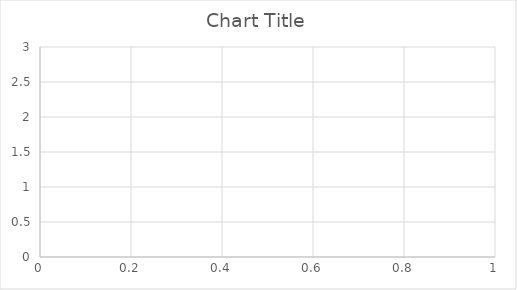
| Category | Series 0 |
|---|---|
| 0 | 0.437 |
| 1 | 0.437 |
| 2 | 0.437 |
| 3 | 0.437 |
| 4 | 0.373 |
| 5 | 0.383 |
| 6 | 0.391 |
| 7 | 0.356 |
| 8 | 0.33 |
| 9 | 0.34 |
| 10 | 0.349 |
| 11 | 0.356 |
| 12 | 0.363 |
| 13 | 0.368 |
| 14 | 0.373 |
| 15 | 0.356 |
| 16 | 0.361 |
| 17 | 0.347 |
| 18 | 0.352 |
| 19 | 0.34 |
| 20 | 0.345 |
| 21 | 0.349 |
| 22 | 0.353 |
| 23 | 0.356 |
| 24 | 0.36 |
| 25 | 0.363 |
| 26 | 0.365 |
| 27 | 0.368 |
| 28 | 0.359 |
| 29 | 0.351 |
| 30 | 0.398 |
| 31 | 0.441 |
| 32 | 0.441 |
| 33 | 0.441 |
| 34 | 0.48 |
| 35 | 0.478 |
| 36 | 0.477 |
| 37 | 0.512 |
| 38 | 0.51 |
| 39 | 0.508 |
| 40 | 0.539 |
| 41 | 0.529 |
| 42 | 0.52 |
| 43 | 0.549 |
| 44 | 0.539 |
| 45 | 0.566 |
| 46 | 0.564 |
| 47 | 0.561 |
| 48 | 0.552 |
| 49 | 0.543 |
| 50 | 0.568 |
| 51 | 0.591 |
| 52 | 0.588 |
| 53 | 0.585 |
| 54 | 0.583 |
| 55 | 0.574 |
| 56 | 0.566 |
| 57 | 0.587 |
| 58 | 0.579 |
| 59 | 0.577 |
| 60 | 0.569 |
| 61 | 0.562 |
| 62 | 0.56 |
| 63 | 0.553 |
| 64 | 0.551 |
| 65 | 0.545 |
| 66 | 0.543 |
| 67 | 0.542 |
| 68 | 0.54 |
| 69 | 0.539 |
| 70 | 0.556 |
| 71 | 0.555 |
| 72 | 0.553 |
| 73 | 0.551 |
| 74 | 0.55 |
| 75 | 0.548 |
| 76 | 0.547 |
| 77 | 0.563 |
| 78 | 0.561 |
| 79 | 0.56 |
| 80 | 0.575 |
| 81 | 0.573 |
| 82 | 0.568 |
| 83 | 0.562 |
| 84 | 0.557 |
| 85 | 0.572 |
| 86 | 0.57 |
| 87 | 0.565 |
| 88 | 0.563 |
| 89 | 0.558 |
| 90 | 0.557 |
| 91 | 0.552 |
| 92 | 0.548 |
| 93 | 0.546 |
| 94 | 0.56 |
| 95 | 0.572 |
| 96 | 0.568 |
| 97 | 0.563 |
| 98 | 0.562 |
| 99 | 0.557 |
| 100 | 0.57 |
| 101 | 0.582 |
| 102 | 0.593 |
| 103 | 0.592 |
| 104 | 0.59 |
| 105 | 0.589 |
| 106 | 0.584 |
| 107 | 0.596 |
| 108 | 0.591 |
| 109 | 0.59 |
| 110 | 0.588 |
| 111 | 0.584 |
| 112 | 0.583 |
| 113 | 0.593 |
| 114 | 0.604 |
| 115 | 0.602 |
| 116 | 0.598 |
| 117 | 0.597 |
| 118 | 0.596 |
| 119 | 0.594 |
| 120 | 0.604 |
| 121 | 0.6 |
| 122 | 0.599 |
| 123 | 0.595 |
| 124 | 0.591 |
| 125 | 0.59 |
| 126 | 0.586 |
| 127 | 0.585 |
| 128 | 0.584 |
| 129 | 0.58 |
| 130 | 0.589 |
| 131 | 0.588 |
| 132 | 0.585 |
| 133 | 0.581 |
| 134 | 0.58 |
| 135 | 0.577 |
| 136 | 0.576 |
| 137 | 0.572 |
| 138 | 0.571 |
| 139 | 0.58 |
| 140 | 0.577 |
| 141 | 0.576 |
| 142 | 0.575 |
| 143 | 0.574 |
| 144 | 0.573 |
| 145 | 0.57 |
| 146 | 0.567 |
| 147 | 0.566 |
| 148 | 0.565 |
| 149 | 0.573 |
| 150 | 0.581 |
| 151 | 0.58 |
| 152 | 0.579 |
| 153 | 0.576 |
| 154 | 0.573 |
| 155 | 0.57 |
| 156 | 0.57 |
| 157 | 0.569 |
| 158 | 0.566 |
| 159 | 0.574 |
| 160 | 0.573 |
| 161 | 0.57 |
| 162 | 0.569 |
| 163 | 0.568 |
| 164 | 0.566 |
| 165 | 0.565 |
| 166 | 0.564 |
| 167 | 0.561 |
| 168 | 0.561 |
| 169 | 0.56 |
| 170 | 0.567 |
| 171 | 0.564 |
| 172 | 0.562 |
| 173 | 0.561 |
| 174 | 0.56 |
| 175 | 0.567 |
| 176 | 0.567 |
| 177 | 0.574 |
| 178 | 0.573 |
| 179 | 0.572 |
| 180 | 0.57 |
| 181 | 0.567 |
| 182 | 0.566 |
| 183 | 0.566 |
| 184 | 0.565 |
| 185 | 0.564 |
| 186 | 0.564 |
| 187 | 0.563 |
| 188 | 0.561 |
| 189 | 0.567 |
| 190 | 0.573 |
| 191 | 0.573 |
| 192 | 0.579 |
| 193 | 0.578 |
| 194 | 0.578 |
| 195 | 0.577 |
| 196 | 0.575 |
| 197 | 0.574 |
| 198 | 0.572 |
| 199 | 0.578 |
| 200 | 0.577 |
| 201 | 0.576 |
| 202 | 0.576 |
| 203 | 0.575 |
| 204 | 0.581 |
| 205 | 0.58 |
| 206 | 0.579 |
| 207 | 0.585 |
| 208 | 0.585 |
| 209 | 0.582 |
| 210 | 0.58 |
| 211 | 0.579 |
| 212 | 0.579 |
| 213 | 0.584 |
| 214 | 0.584 |
| 215 | 0.583 |
| 216 | 0.581 |
| 217 | 0.58 |
| 218 | 0.58 |
| 219 | 0.585 |
| 220 | 0.591 |
| 221 | 0.588 |
| 222 | 0.588 |
| 223 | 0.587 |
| 224 | 0.586 |
| 225 | 0.586 |
| 226 | 0.584 |
| 227 | 0.582 |
| 228 | 0.581 |
| 229 | 0.586 |
| 230 | 0.584 |
| 231 | 0.582 |
| 232 | 0.582 |
| 233 | 0.58 |
| 234 | 0.585 |
| 235 | 0.59 |
| 236 | 0.589 |
| 237 | 0.587 |
| 238 | 0.585 |
| 239 | 0.59 |
| 240 | 0.59 |
| 241 | 0.589 |
| 242 | 0.587 |
| 243 | 0.592 |
| 244 | 0.591 |
| 245 | 0.591 |
| 246 | 0.59 |
| 247 | 0.588 |
| 248 | 0.586 |
| 249 | 0.586 |
| 250 | 0.585 |
| 251 | 0.585 |
| 252 | 0.589 |
| 253 | 0.587 |
| 254 | 0.592 |
| 255 | 0.597 |
| 256 | 0.596 |
| 257 | 0.601 |
| 258 | 0.599 |
| 259 | 0.604 |
| 260 | 0.602 |
| 261 | 0.601 |
| 262 | 0.6 |
| 263 | 0.599 |
| 264 | 0.603 |
| 265 | 0.602 |
| 266 | 0.602 |
| 267 | 0.601 |
| 268 | 0.601 |
| 269 | 0.599 |
| 270 | 0.598 |
| 271 | 0.598 |
| 272 | 0.596 |
| 273 | 0.594 |
| 274 | 0.592 |
| 275 | 0.592 |
| 276 | 0.59 |
| 277 | 0.59 |
| 278 | 0.589 |
| 279 | 0.587 |
| 280 | 0.587 |
| 281 | 0.591 |
| 282 | 0.589 |
| 283 | 0.588 |
| 284 | 0.592 |
| 285 | 0.596 |
| 286 | 0.596 |
| 287 | 0.594 |
| 288 | 0.593 |
| 289 | 0.592 |
| 290 | 0.591 |
| 291 | 0.59 |
| 292 | 0.589 |
| 293 | 0.593 |
| 294 | 0.593 |
| 295 | 0.592 |
| 296 | 0.592 |
| 297 | 0.596 |
| 298 | 0.594 |
| 299 | 0.593 |
| 300 | 0.592 |
| 301 | 0.591 |
| 302 | 0.595 |
| 303 | 0.599 |
| 304 | 0.599 |
| 305 | 0.598 |
| 306 | 0.602 |
| 307 | 0.6 |
| 308 | 0.599 |
| 309 | 0.597 |
| 310 | 0.597 |
| 311 | 0.595 |
| 312 | 0.594 |
| 313 | 0.592 |
| 314 | 0.592 |
| 315 | 0.596 |
| 316 | 0.595 |
| 317 | 0.594 |
| 318 | 0.597 |
| 319 | 0.597 |
| 320 | 0.601 |
| 321 | 0.6 |
| 322 | 0.599 |
| 323 | 0.597 |
| 324 | 0.597 |
| 325 | 0.595 |
| 326 | 0.594 |
| 327 | 0.593 |
| 328 | 0.593 |
| 329 | 0.592 |
| 330 | 0.592 |
| 331 | 0.595 |
| 332 | 0.594 |
| 333 | 0.592 |
| 334 | 0.591 |
| 335 | 0.591 |
| 336 | 0.594 |
| 337 | 0.594 |
| 338 | 0.593 |
| 339 | 0.592 |
| 340 | 0.591 |
| 341 | 0.591 |
| 342 | 0.589 |
| 343 | 0.593 |
| 344 | 0.596 |
| 345 | 0.595 |
| 346 | 0.594 |
| 347 | 0.593 |
| 348 | 0.593 |
| 349 | 0.592 |
| 350 | 0.591 |
| 351 | 0.59 |
| 352 | 0.588 |
| 353 | 0.587 |
| 354 | 0.587 |
| 355 | 0.585 |
| 356 | 0.585 |
| 357 | 0.588 |
| 358 | 0.592 |
| 359 | 0.591 |
| 360 | 0.591 |
| 361 | 0.589 |
| 362 | 0.589 |
| 363 | 0.589 |
| 364 | 0.588 |
| 365 | 0.588 |
| 366 | 0.586 |
| 367 | 0.59 |
| 368 | 0.588 |
| 369 | 0.587 |
| 370 | 0.59 |
| 371 | 0.59 |
| 372 | 0.593 |
| 373 | 0.593 |
| 374 | 0.592 |
| 375 | 0.592 |
| 376 | 0.591 |
| 377 | 0.594 |
| 378 | 0.597 |
| 379 | 0.597 |
| 380 | 0.596 |
| 381 | 0.595 |
| 382 | 0.594 |
| 383 | 0.593 |
| 384 | 0.592 |
| 385 | 0.595 |
| 386 | 0.595 |
| 387 | 0.598 |
| 388 | 0.601 |
| 389 | 0.6 |
| 390 | 0.603 |
| 391 | 0.606 |
| 392 | 0.605 |
| 393 | 0.605 |
| 394 | 0.604 |
| 395 | 0.602 |
| 396 | 0.602 |
| 397 | 0.601 |
| 398 | 0.6 |
| 399 | 0.6 |
| 400 | 0.6 |
| 401 | 0.599 |
| 402 | 0.598 |
| 403 | 0.601 |
| 404 | 0.6 |
| 405 | 0.599 |
| 406 | 0.602 |
| 407 | 0.602 |
| 408 | 0.605 |
| 409 | 0.604 |
| 410 | 0.603 |
| 411 | 0.602 |
| 412 | 0.605 |
| 413 | 0.604 |
| 414 | 0.603 |
| 415 | 0.603 |
| 416 | 0.602 |
| 417 | 0.605 |
| 418 | 0.604 |
| 419 | 0.603 |
| 420 | 0.606 |
| 421 | 0.605 |
| 422 | 0.605 |
| 423 | 0.604 |
| 424 | 0.603 |
| 425 | 0.603 |
| 426 | 0.603 |
| 427 | 0.601 |
| 428 | 0.604 |
| 429 | 0.607 |
| 430 | 0.607 |
| 431 | 0.609 |
| 432 | 0.608 |
| 433 | 0.608 |
| 434 | 0.607 |
| 435 | 0.607 |
| 436 | 0.607 |
| 437 | 0.606 |
| 438 | 0.609 |
| 439 | 0.609 |
| 440 | 0.607 |
| 441 | 0.606 |
| 442 | 0.609 |
| 443 | 0.609 |
| 444 | 0.608 |
| 445 | 0.607 |
| 446 | 0.607 |
| 447 | 0.606 |
| 448 | 0.606 |
| 449 | 0.609 |
| 450 | 0.608 |
| 451 | 0.608 |
| 452 | 0.608 |
| 453 | 0.607 |
| 454 | 0.607 |
| 455 | 0.609 |
| 456 | 0.608 |
| 457 | 0.608 |
| 458 | 0.607 |
| 459 | 0.606 |
| 460 | 0.609 |
| 461 | 0.608 |
| 462 | 0.611 |
| 463 | 0.609 |
| 464 | 0.609 |
| 465 | 0.609 |
| 466 | 0.608 |
| 467 | 0.607 |
| 468 | 0.607 |
| 469 | 0.607 |
| 470 | 0.606 |
| 471 | 0.609 |
| 472 | 0.608 |
| 473 | 0.611 |
| 474 | 0.611 |
| 475 | 0.61 |
| 476 | 0.61 |
| 477 | 0.612 |
| 478 | 0.612 |
| 479 | 0.611 |
| 480 | 0.61 |
| 481 | 0.609 |
| 482 | 0.608 |
| 483 | 0.607 |
| 484 | 0.607 |
| 485 | 0.607 |
| 486 | 0.606 |
| 487 | 0.605 |
| 488 | 0.608 |
| 489 | 0.607 |
| 490 | 0.607 |
| 491 | 0.61 |
| 492 | 0.609 |
| 493 | 0.609 |
| 494 | 0.608 |
| 495 | 0.608 |
| 496 | 0.608 |
| 497 | 0.607 |
| 498 | 0.607 |
| 499 | 0.607 |
| 500 | 0.609 |
| 501 | 0.609 |
| 502 | 0.608 |
| 503 | 0.608 |
| 504 | 0.607 |
| 505 | 0.606 |
| 506 | 0.606 |
| 507 | 0.605 |
| 508 | 0.604 |
| 509 | 0.604 |
| 510 | 0.603 |
| 511 | 0.605 |
| 512 | 0.605 |
| 513 | 0.604 |
| 514 | 0.603 |
| 515 | 0.602 |
| 516 | 0.601 |
| 517 | 0.604 |
| 518 | 0.603 |
| 519 | 0.605 |
| 520 | 0.604 |
| 521 | 0.606 |
| 522 | 0.609 |
| 523 | 0.608 |
| 524 | 0.607 |
| 525 | 0.606 |
| 526 | 0.606 |
| 527 | 0.605 |
| 528 | 0.604 |
| 529 | 0.604 |
| 530 | 0.603 |
| 531 | 0.602 |
| 532 | 0.604 |
| 533 | 0.603 |
| 534 | 0.603 |
| 535 | 0.602 |
| 536 | 0.601 |
| 537 | 0.603 |
| 538 | 0.605 |
| 539 | 0.604 |
| 540 | 0.604 |
| 541 | 0.604 |
| 542 | 0.603 |
| 543 | 0.603 |
| 544 | 0.603 |
| 545 | 0.605 |
| 546 | 0.605 |
| 547 | 0.604 |
| 548 | 0.604 |
| 549 | 0.603 |
| 550 | 0.603 |
| 551 | 0.602 |
| 552 | 0.601 |
| 553 | 0.601 |
| 554 | 0.6 |
| 555 | 0.6 |
| 556 | 0.6 |
| 557 | 0.6 |
| 558 | 0.599 |
| 559 | 0.598 |
| 560 | 0.597 |
| 561 | 0.599 |
| 562 | 0.598 |
| 563 | 0.598 |
| 564 | 0.597 |
| 565 | 0.596 |
| 566 | 0.598 |
| 567 | 0.597 |
| 568 | 0.6 |
| 569 | 0.599 |
| 570 | 0.601 |
| 571 | 0.601 |
| 572 | 0.6 |
| 573 | 0.599 |
| 574 | 0.601 |
| 575 | 0.601 |
| 576 | 0.6 |
| 577 | 0.6 |
| 578 | 0.599 |
| 579 | 0.598 |
| 580 | 0.6 |
| 581 | 0.6 |
| 582 | 0.599 |
| 583 | 0.598 |
| 584 | 0.598 |
| 585 | 0.597 |
| 586 | 0.599 |
| 587 | 0.601 |
| 588 | 0.6 |
| 589 | 0.599 |
| 590 | 0.598 |
| 591 | 0.598 |
| 592 | 0.598 |
| 593 | 0.6 |
| 594 | 0.6 |
| 595 | 0.599 |
| 596 | 0.599 |
| 597 | 0.599 |
| 598 | 0.601 |
| 599 | 0.6 |
| 600 | 0.6 |
| 601 | 0.599 |
| 602 | 0.599 |
| 603 | 0.598 |
| 604 | 0.598 |
| 605 | 0.597 |
| 606 | 0.597 |
| 607 | 0.599 |
| 608 | 0.599 |
| 609 | 0.598 |
| 610 | 0.597 |
| 611 | 0.596 |
| 612 | 0.598 |
| 613 | 0.598 |
| 614 | 0.597 |
| 615 | 0.599 |
| 616 | 0.601 |
| 617 | 0.6 |
| 618 | 0.6 |
| 619 | 0.599 |
| 620 | 0.599 |
| 621 | 0.598 |
| 622 | 0.598 |
| 623 | 0.597 |
| 624 | 0.597 |
| 625 | 0.596 |
| 626 | 0.595 |
| 627 | 0.595 |
| 628 | 0.595 |
| 629 | 0.594 |
| 630 | 0.593 |
| 631 | 0.593 |
| 632 | 0.592 |
| 633 | 0.594 |
| 634 | 0.594 |
| 635 | 0.593 |
| 636 | 0.593 |
| 637 | 0.593 |
| 638 | 0.592 |
| 639 | 0.592 |
| 640 | 0.592 |
| 641 | 0.591 |
| 642 | 0.591 |
| 643 | 0.59 |
| 644 | 0.592 |
| 645 | 0.592 |
| 646 | 0.591 |
| 647 | 0.591 |
| 648 | 0.59 |
| 649 | 0.592 |
| 650 | 0.591 |
| 651 | 0.591 |
| 652 | 0.591 |
| 653 | 0.591 |
| 654 | 0.59 |
| 655 | 0.59 |
| 656 | 0.59 |
| 657 | 0.59 |
| 658 | 0.59 |
| 659 | 0.591 |
| 660 | 0.591 |
| 661 | 0.591 |
| 662 | 0.59 |
| 663 | 0.59 |
| 664 | 0.59 |
| 665 | 0.59 |
| 666 | 0.589 |
| 667 | 0.589 |
| 668 | 0.589 |
| 669 | 0.589 |
| 670 | 0.588 |
| 671 | 0.588 |
| 672 | 0.588 |
| 673 | 0.587 |
| 674 | 0.587 |
| 675 | 0.586 |
| 676 | 0.586 |
| 677 | 0.585 |
| 678 | 0.585 |
| 679 | 0.585 |
| 680 | 0.585 |
| 681 | 0.587 |
| 682 | 0.586 |
| 683 | 0.588 |
| 684 | 0.588 |
| 685 | 0.588 |
| 686 | 0.587 |
| 687 | 0.587 |
| 688 | 0.586 |
| 689 | 0.586 |
| 690 | 0.586 |
| 691 | 0.586 |
| 692 | 0.586 |
| 693 | 0.585 |
| 694 | 0.585 |
| 695 | 0.585 |
| 696 | 0.584 |
| 697 | 0.584 |
| 698 | 0.583 |
| 699 | 0.583 |
| 700 | 0.583 |
| 701 | 0.582 |
| 702 | 0.582 |
| 703 | 0.582 |
| 704 | 0.581 |
| 705 | 0.583 |
| 706 | 0.583 |
| 707 | 0.583 |
| 708 | 0.582 |
| 709 | 0.581 |
| 710 | 0.581 |
| 711 | 0.58 |
| 712 | 0.579 |
| 713 | 0.579 |
| 714 | 0.578 |
| 715 | 0.58 |
| 716 | 0.58 |
| 717 | 0.58 |
| 718 | 0.579 |
| 719 | 0.578 |
| 720 | 0.578 |
| 721 | 0.578 |
| 722 | 0.577 |
| 723 | 0.577 |
| 724 | 0.577 |
| 725 | 0.577 |
| 726 | 0.579 |
| 727 | 0.58 |
| 728 | 0.58 |
| 729 | 0.58 |
| 730 | 0.579 |
| 731 | 0.579 |
| 732 | 0.579 |
| 733 | 0.578 |
| 734 | 0.578 |
| 735 | 0.577 |
| 736 | 0.577 |
| 737 | 0.576 |
| 738 | 0.576 |
| 739 | 0.576 |
| 740 | 0.575 |
| 741 | 0.577 |
| 742 | 0.578 |
| 743 | 0.578 |
| 744 | 0.578 |
| 745 | 0.578 |
| 746 | 0.578 |
| 747 | 0.577 |
| 748 | 0.577 |
| 749 | 0.577 |
| 750 | 0.579 |
| 751 | 0.578 |
| 752 | 0.578 |
| 753 | 0.577 |
| 754 | 0.579 |
| 755 | 0.579 |
| 756 | 0.578 |
| 757 | 0.578 |
| 758 | 0.578 |
| 759 | 0.577 |
| 760 | 0.577 |
| 761 | 0.577 |
| 762 | 0.579 |
| 763 | 0.579 |
| 764 | 0.58 |
| 765 | 0.58 |
| 766 | 0.58 |
| 767 | 0.58 |
| 768 | 0.581 |
| 769 | 0.581 |
| 770 | 0.58 |
| 771 | 0.58 |
| 772 | 0.58 |
| 773 | 0.579 |
| 774 | 0.579 |
| 775 | 0.579 |
| 776 | 0.578 |
| 777 | 0.58 |
| 778 | 0.582 |
| 779 | 0.581 |
| 780 | 0.581 |
| 781 | 0.581 |
| 782 | 0.58 |
| 783 | 0.58 |
| 784 | 0.58 |
| 785 | 0.579 |
| 786 | 0.581 |
| 787 | 0.58 |
| 788 | 0.58 |
| 789 | 0.581 |
| 790 | 0.581 |
| 791 | 0.583 |
| 792 | 0.582 |
| 793 | 0.582 |
| 794 | 0.581 |
| 795 | 0.581 |
| 796 | 0.581 |
| 797 | 0.581 |
| 798 | 0.582 |
| 799 | 0.582 |
| 800 | 0.581 |
| 801 | 0.581 |
| 802 | 0.583 |
| 803 | 0.583 |
| 804 | 0.582 |
| 805 | 0.582 |
| 806 | 0.582 |
| 807 | 0.582 |
| 808 | 0.581 |
| 809 | 0.581 |
| 810 | 0.583 |
| 811 | 0.582 |
| 812 | 0.582 |
| 813 | 0.582 |
| 814 | 0.582 |
| 815 | 0.581 |
| 816 | 0.58 |
| 817 | 0.58 |
| 818 | 0.58 |
| 819 | 0.579 |
| 820 | 0.579 |
| 821 | 0.579 |
| 822 | 0.579 |
| 823 | 0.578 |
| 824 | 0.58 |
| 825 | 0.579 |
| 826 | 0.579 |
| 827 | 0.579 |
| 828 | 0.578 |
| 829 | 0.578 |
| 830 | 0.577 |
| 831 | 0.577 |
| 832 | 0.577 |
| 833 | 0.577 |
| 834 | 0.576 |
| 835 | 0.576 |
| 836 | 0.576 |
| 837 | 0.575 |
| 838 | 0.575 |
| 839 | 0.577 |
| 840 | 0.578 |
| 841 | 0.578 |
| 842 | 0.579 |
| 843 | 0.578 |
| 844 | 0.578 |
| 845 | 0.58 |
| 846 | 0.579 |
| 847 | 0.579 |
| 848 | 0.579 |
| 849 | 0.58 |
| 850 | 0.58 |
| 851 | 0.581 |
| 852 | 0.581 |
| 853 | 0.581 |
| 854 | 0.581 |
| 855 | 0.58 |
| 856 | 0.58 |
| 857 | 0.58 |
| 858 | 0.58 |
| 859 | 0.579 |
| 860 | 0.579 |
| 861 | 0.58 |
| 862 | 0.582 |
| 863 | 0.582 |
| 864 | 0.581 |
| 865 | 0.58 |
| 866 | 0.58 |
| 867 | 0.579 |
| 868 | 0.579 |
| 869 | 0.579 |
| 870 | 0.578 |
| 871 | 0.578 |
| 872 | 0.578 |
| 873 | 0.577 |
| 874 | 0.577 |
| 875 | 0.577 |
| 876 | 0.578 |
| 877 | 0.578 |
| 878 | 0.578 |
| 879 | 0.577 |
| 880 | 0.577 |
| 881 | 0.577 |
| 882 | 0.576 |
| 883 | 0.576 |
| 884 | 0.576 |
| 885 | 0.575 |
| 886 | 0.575 |
| 887 | 0.574 |
| 888 | 0.574 |
| 889 | 0.573 |
| 890 | 0.573 |
| 891 | 0.573 |
| 892 | 0.573 |
| 893 | 0.572 |
| 894 | 0.572 |
| 895 | 0.572 |
| 896 | 0.572 |
| 897 | 0.571 |
| 898 | 0.571 |
| 899 | 0.572 |
| 900 | 0.572 |
| 901 | 0.572 |
| 902 | 0.572 |
| 903 | 0.571 |
| 904 | 0.571 |
| 905 | 0.571 |
| 906 | 0.571 |
| 907 | 0.571 |
| 908 | 0.57 |
| 909 | 0.572 |
| 910 | 0.571 |
| 911 | 0.571 |
| 912 | 0.571 |
| 913 | 0.571 |
| 914 | 0.57 |
| 915 | 0.572 |
| 916 | 0.572 |
| 917 | 0.572 |
| 918 | 0.571 |
| 919 | 0.571 |
| 920 | 0.571 |
| 921 | 0.571 |
| 922 | 0.57 |
| 923 | 0.57 |
| 924 | 0.57 |
| 925 | 0.57 |
| 926 | 0.57 |
| 927 | 0.569 |
| 928 | 0.57 |
| 929 | 0.57 |
| 930 | 0.57 |
| 931 | 0.57 |
| 932 | 0.569 |
| 933 | 0.569 |
| 934 | 0.57 |
| 935 | 0.57 |
| 936 | 0.57 |
| 937 | 0.569 |
| 938 | 0.569 |
| 939 | 0.568 |
| 940 | 0.568 |
| 941 | 0.568 |
| 942 | 0.567 |
| 943 | 0.569 |
| 944 | 0.569 |
| 945 | 0.57 |
| 946 | 0.569 |
| 947 | 0.569 |
| 948 | 0.569 |
| 949 | 0.568 |
| 950 | 0.568 |
| 951 | 0.568 |
| 952 | 0.567 |
| 953 | 0.567 |
| 954 | 0.567 |
| 955 | 0.566 |
| 956 | 0.566 |
| 957 | 0.566 |
| 958 | 0.566 |
| 959 | 0.565 |
| 960 | 0.565 |
| 961 | 0.565 |
| 962 | 0.565 |
| 963 | 0.564 |
| 964 | 0.564 |
| 965 | 0.566 |
| 966 | 0.565 |
| 967 | 0.565 |
| 968 | 0.564 |
| 969 | 0.564 |
| 970 | 0.564 |
| 971 | 0.565 |
| 972 | 0.565 |
| 973 | 0.565 |
| 974 | 0.565 |
| 975 | 0.564 |
| 976 | 0.566 |
| 977 | 0.565 |
| 978 | 0.565 |
| 979 | 0.564 |
| 980 | 0.564 |
| 981 | 0.564 |
| 982 | 0.564 |
| 983 | 0.563 |
| 984 | 0.563 |
| 985 | 0.563 |
| 986 | 0.563 |
| 987 | 0.564 |
| 988 | 0.565 |
| 989 | 0.565 |
| 990 | 0.565 |
| 991 | 0.564 |
| 992 | 0.564 |
| 993 | 0.564 |
| 994 | 0.564 |
| 995 | 0.564 |
| 996 | 0.564 |
| 997 | 0.565 |
| 998 | 0.565 |
| 999 | 0.566 |